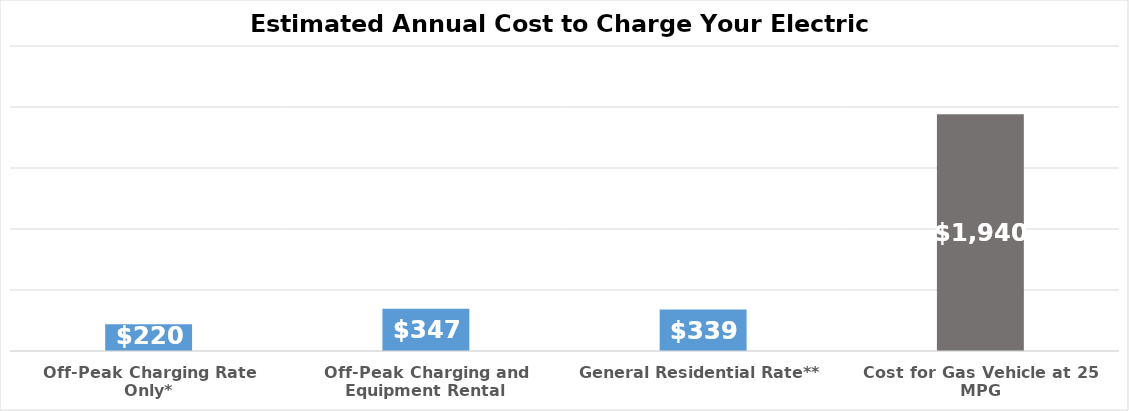
| Category | Series 0 |
|---|---|
| Off-Peak Charging Rate Only* | 219.616 |
| Off-Peak Charging and Equipment Rental | 346.696 |
| General Residential Rate** | 339.217 |
| Cost for Gas Vehicle at 25 MPG | 1940 |